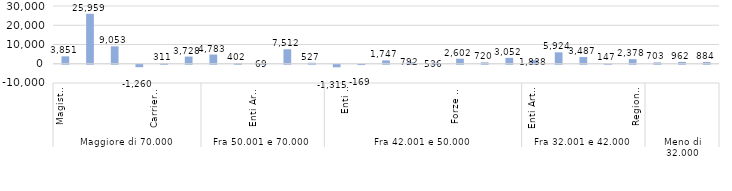
| Category | Series 0 |
|---|---|
| 0 | 3850.506 |
| 1 | 25959.302 |
| 2 | 9052.786 |
| 3 | -1260.499 |
| 4 | 311.159 |
| 5 | 3728.254 |
| 6 | 4782.812 |
| 7 | 402.247 |
| 8 | 69.358 |
| 9 | 7512.213 |
| 10 | 526.935 |
| 11 | -1315.42 |
| 12 | -168.632 |
| 13 | 1747.154 |
| 14 | 792.45 |
| 15 | 536.344 |
| 16 | 2602.101 |
| 17 | 720.011 |
| 18 | 3052.241 |
| 19 | 1837.741 |
| 20 | 5923.564 |
| 21 | 3486.709 |
| 22 | 147.307 |
| 23 | 2378.372 |
| 24 | 703.092 |
| 25 | 961.666 |
| 26 | 884.394 |